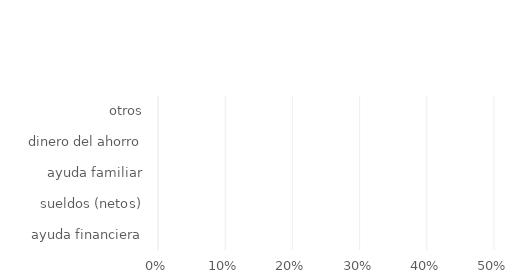
| Category | Series 0 |
|---|---|
| ayuda financiera | 0 |
| sueldos (netos) | 0 |
| ayuda familiar | 0 |
| dinero del ahorro | 0 |
| otros | 0 |